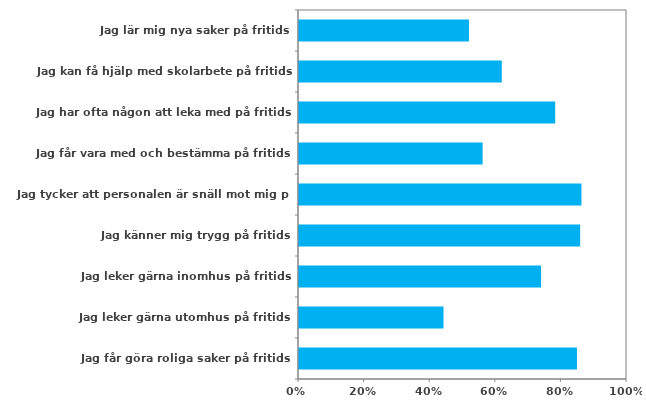
| Category | (Alla) |
|---|---|
| Jag lär mig nya saker på fritids | 0.518 |
| Jag kan få hjälp med skolarbete på fritids | 0.618 |
| Jag har ofta någon att leka med på fritids | 0.781 |
| Jag får vara med och bestämma på fritids | 0.56 |
| Jag tycker att personalen är snäll mot mig på fritids | 0.861 |
| Jag känner mig trygg på fritids | 0.857 |
| Jag leker gärna inomhus på fritids | 0.738 |
| Jag leker gärna utomhus på fritids | 0.441 |
| Jag får göra roliga saker på fritids | 0.847 |